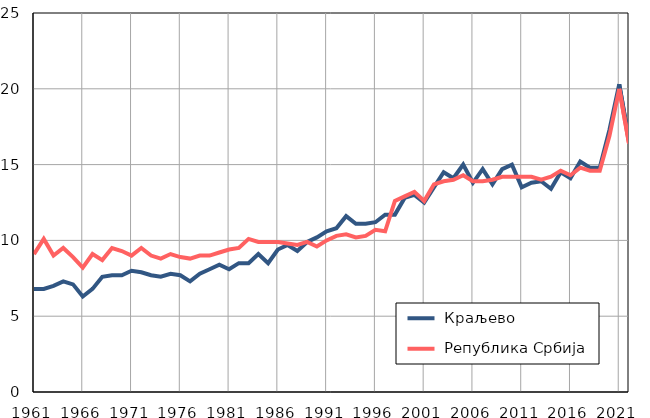
| Category |  Краљево |  Република Србија |
|---|---|---|
| 1961.0 | 6.8 | 9.1 |
| 1962.0 | 6.8 | 10.1 |
| 1963.0 | 7 | 9 |
| 1964.0 | 7.3 | 9.5 |
| 1965.0 | 7.1 | 8.9 |
| 1966.0 | 6.3 | 8.2 |
| 1967.0 | 6.8 | 9.1 |
| 1968.0 | 7.6 | 8.7 |
| 1969.0 | 7.7 | 9.5 |
| 1970.0 | 7.7 | 9.3 |
| 1971.0 | 8 | 9 |
| 1972.0 | 7.9 | 9.5 |
| 1973.0 | 7.7 | 9 |
| 1974.0 | 7.6 | 8.8 |
| 1975.0 | 7.8 | 9.1 |
| 1976.0 | 7.7 | 8.9 |
| 1977.0 | 7.3 | 8.8 |
| 1978.0 | 7.8 | 9 |
| 1979.0 | 8.1 | 9 |
| 1980.0 | 8.4 | 9.2 |
| 1981.0 | 8.1 | 9.4 |
| 1982.0 | 8.5 | 9.5 |
| 1983.0 | 8.5 | 10.1 |
| 1984.0 | 9.1 | 9.9 |
| 1985.0 | 8.5 | 9.9 |
| 1986.0 | 9.4 | 9.9 |
| 1987.0 | 9.7 | 9.8 |
| 1988.0 | 9.3 | 9.7 |
| 1989.0 | 9.9 | 9.9 |
| 1990.0 | 10.2 | 9.6 |
| 1991.0 | 10.6 | 10 |
| 1992.0 | 10.8 | 10.3 |
| 1993.0 | 11.6 | 10.4 |
| 1994.0 | 11.1 | 10.2 |
| 1995.0 | 11.1 | 10.3 |
| 1996.0 | 11.2 | 10.7 |
| 1997.0 | 11.7 | 10.6 |
| 1998.0 | 11.7 | 12.6 |
| 1999.0 | 12.8 | 12.9 |
| 2000.0 | 13 | 13.2 |
| 2001.0 | 12.5 | 12.6 |
| 2002.0 | 13.5 | 13.7 |
| 2003.0 | 14.5 | 13.9 |
| 2004.0 | 14.1 | 14 |
| 2005.0 | 15 | 14.3 |
| 2006.0 | 13.8 | 13.9 |
| 2007.0 | 14.7 | 13.9 |
| 2008.0 | 13.7 | 14 |
| 2009.0 | 14.7 | 14.2 |
| 2010.0 | 15 | 14.2 |
| 2011.0 | 13.5 | 14.2 |
| 2012.0 | 13.8 | 14.2 |
| 2013.0 | 13.9 | 14 |
| 2014.0 | 13.4 | 14.2 |
| 2015.0 | 14.5 | 14.6 |
| 2016.0 | 14.1 | 14.3 |
| 2017.0 | 15.2 | 14.8 |
| 2018.0 | 14.8 | 14.6 |
| 2019.0 | 14.8 | 14.6 |
| 2020.0 | 17.3 | 16.9 |
| 2021.0 | 20.3 | 20 |
| 2022.0 | 16.6 | 16.4 |